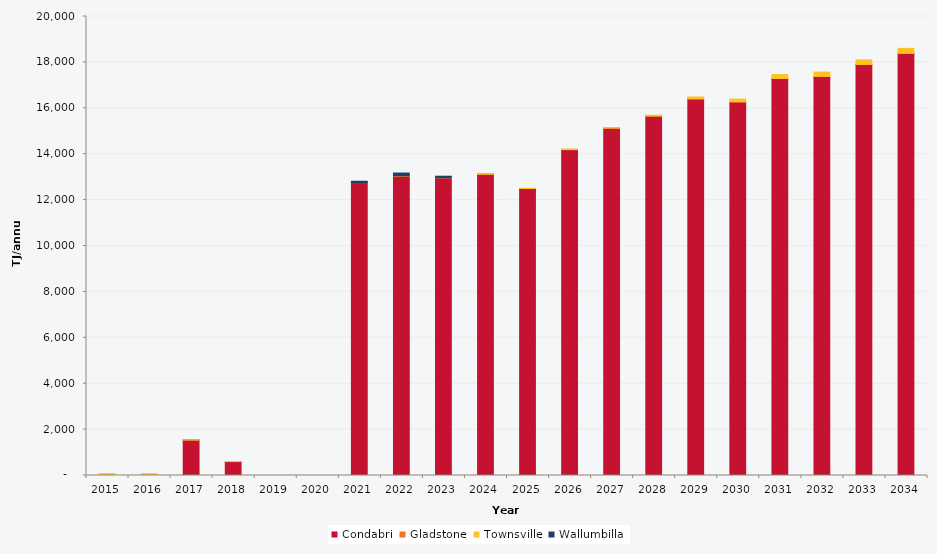
| Category | Condabri | Gladstone | Townsville | Wallumbilla |
|---|---|---|---|---|
| 2015.0 | 0 | 0 | 82.14 | 0 |
| 2016.0 | 0 | 0 | 79.077 | 0 |
| 2017.0 | 1545.755 | 1.393 | 1.363 | 0 |
| 2018.0 | 601.629 | 8.554 | 2.074 | 0 |
| 2019.0 | 0 | 1.329 | 0 | 0 |
| 2020.0 | 0 | 0 | 0 | 0 |
| 2021.0 | 12763.054 | 1.512 | 0 | 56.471 |
| 2022.0 | 13049.201 | 1.033 | 7.882 | 121.516 |
| 2023.0 | 12973.015 | 1.047 | 0.7 | 66.198 |
| 2024.0 | 13127.368 | 0.922 | 8.709 | 0 |
| 2025.0 | 12506.12 | 0 | 9.099 | 0 |
| 2026.0 | 14198.794 | 1.69 | 27.77 | 0 |
| 2027.0 | 15135.163 | 1.969 | 13.631 | 0 |
| 2028.0 | 15662.434 | 0.65 | 34.481 | 0 |
| 2029.0 | 16409.992 | 1.429 | 81.81 | 0 |
| 2030.0 | 16276.906 | 0 | 124.528 | 0 |
| 2031.0 | 17298.977 | 2.196 | 168.024 | 0 |
| 2032.0 | 17390.064 | 1.267 | 186.513 | 0 |
| 2033.0 | 17911.471 | 1.44 | 194.509 | 0 |
| 2034.0 | 18393.617 | 2.065 | 214.585 | 0 |